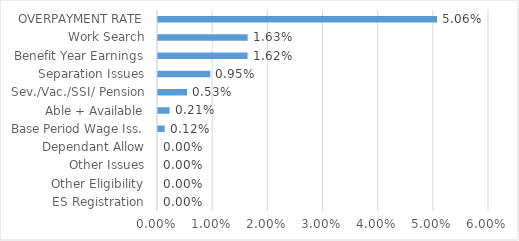
| Category | Series 0 |
|---|---|
| ES Registration | 0 |
| Other Eligibility | 0 |
| Other Issues | 0 |
| Dependant Allow | 0 |
| Base Period Wage Iss. | 0.001 |
| Able + Available | 0.002 |
| Sev./Vac./SSI/ Pension | 0.005 |
| Separation Issues | 0.009 |
| Benefit Year Earnings | 0.016 |
| Work Search | 0.016 |
| OVERPAYMENT RATE | 0.051 |